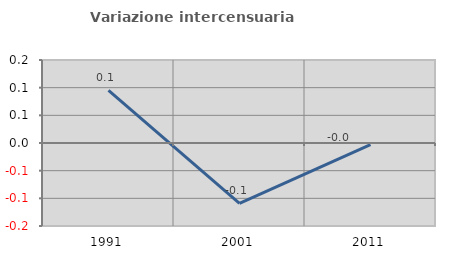
| Category | Variazione intercensuaria annua |
|---|---|
| 1991.0 | 0.095 |
| 2001.0 | -0.109 |
| 2011.0 | -0.003 |